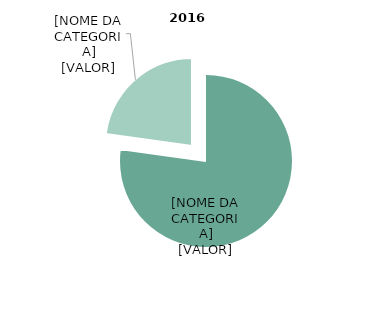
| Category | 2016 |
|---|---|
| DVD | 0.772 |
| Blu-ray | 0.228 |